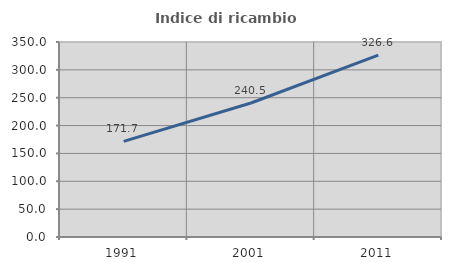
| Category | Indice di ricambio occupazionale  |
|---|---|
| 1991.0 | 171.698 |
| 2001.0 | 240.506 |
| 2011.0 | 326.562 |